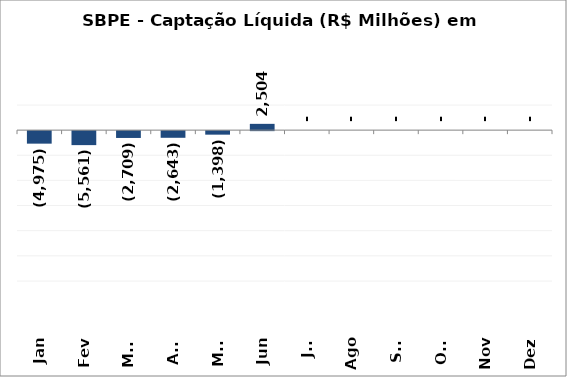
| Category | SBPE - Captação Líquida (R$ Milhões) em 2018 |
|---|---|
| Jan | -4974.781 |
| Fev | -5560.998 |
| Mar | -2708.602 |
| Abr | -2643.342 |
| Mai | -1398.295 |
| Jun | 2504.228 |
| Jul | 0 |
| Ago | 0 |
| Set | 0 |
| Out | 0 |
| Nov | 0 |
| Dez | 0 |